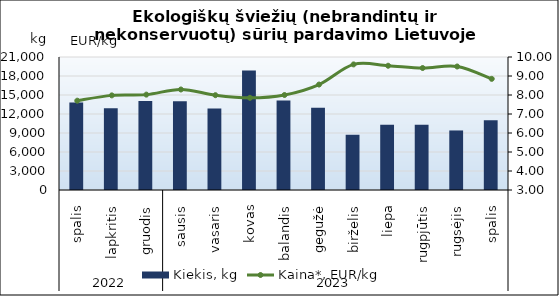
| Category | Kiekis, kg |
|---|---|
| 0 | 13822 |
| 1 | 12911 |
| 2 | 14056 |
| 3 | 14031 |
| 4 | 12860 |
| 5 | 18883 |
| 6 | 14139 |
| 7 | 12982 |
| 8 | 8721 |
| 9 | 10293 |
| 10 | 10312 |
| 11 | 9401 |
| 12 | 10999 |